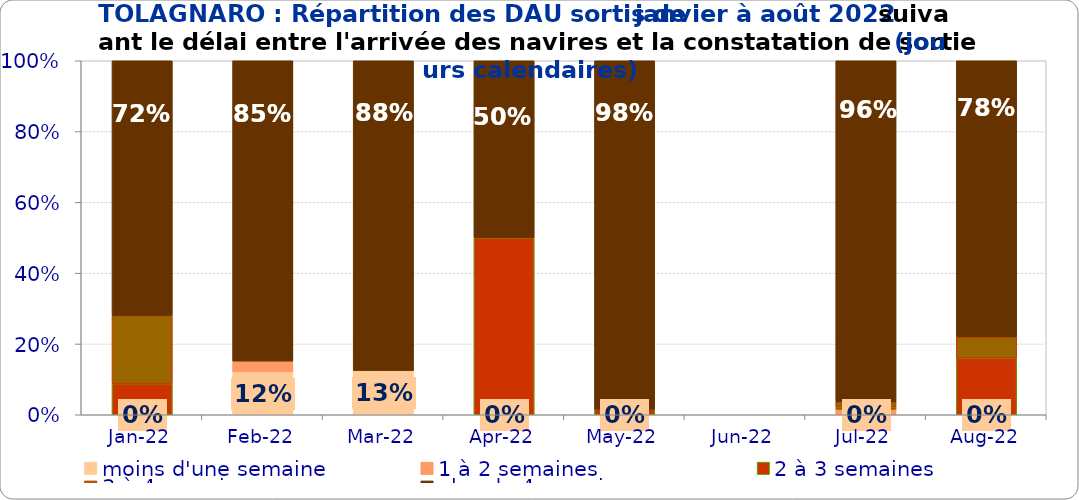
| Category | moins d'une semaine | 1 à 2 semaines | 2 à 3 semaines | 3 à 4 semaines | plus de 4 semaines |
|---|---|---|---|---|---|
| 2022-01-01 | 0 | 0 | 0.088 | 0.193 | 0.719 |
| 2022-02-01 | 0.121 | 0.03 | 0 | 0 | 0.848 |
| 2022-03-01 | 0.125 | 0 | 0 | 0 | 0.875 |
| 2022-04-01 | 0 | 0 | 0.5 | 0 | 0.5 |
| 2022-05-01 | 0 | 0 | 0.015 | 0 | 0.985 |
| 2022-06-01 | 0 | 0 | 0 | 0 | 0 |
| 2022-07-01 | 0 | 0.015 | 0.007 | 0.015 | 0.963 |
| 2022-08-01 | 0 | 0 | 0.16 | 0.06 | 0.78 |